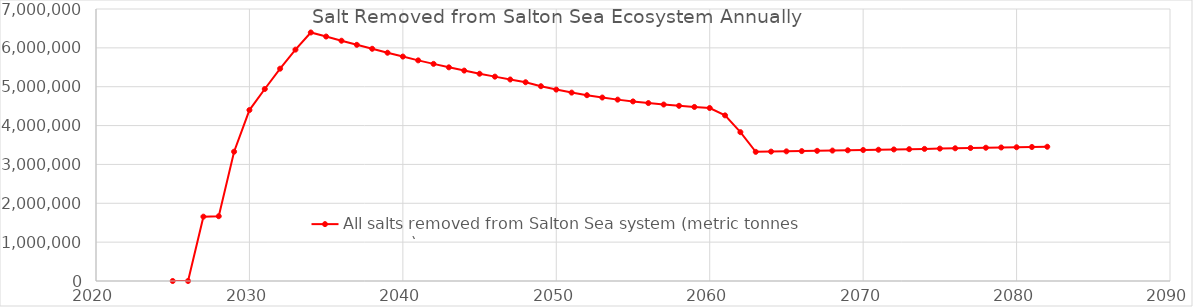
| Category | All salts removed from Salton Sea system (metric tonnes per year) |
|---|---|
| 2025.0 | 0 |
| 2026.0 | 0 |
| 2027.0 | 1655749.961 |
| 2028.0 | 1667511.608 |
| 2029.0 | 3327902.366 |
| 2030.0 | 4399655.873 |
| 2031.0 | 4941128.841 |
| 2032.0 | 5464168.476 |
| 2033.0 | 5954331.5 |
| 2034.0 | 6395647.052 |
| 2035.0 | 6291263.904 |
| 2036.0 | 6183656.916 |
| 2037.0 | 6077883.035 |
| 2038.0 | 5976078.027 |
| 2039.0 | 5874285.273 |
| 2040.0 | 5775570.348 |
| 2041.0 | 5677861.344 |
| 2042.0 | 5587767.18 |
| 2043.0 | 5498803.845 |
| 2044.0 | 5414957.753 |
| 2045.0 | 5333943.542 |
| 2046.0 | 5259218.141 |
| 2047.0 | 5185791.137 |
| 2048.0 | 5115058.603 |
| 2049.0 | 5012958.417 |
| 2050.0 | 4926393.09 |
| 2051.0 | 4848390.866 |
| 2052.0 | 4781469.663 |
| 2053.0 | 4721726.344 |
| 2054.0 | 4667537.967 |
| 2055.0 | 4621267.473 |
| 2056.0 | 4579195.052 |
| 2057.0 | 4541694.574 |
| 2058.0 | 4508854.731 |
| 2059.0 | 4478982.462 |
| 2060.0 | 4451842.252 |
| 2061.0 | 4262600.164 |
| 2062.0 | 3830134.739 |
| 2063.0 | 3323645.579 |
| 2064.0 | 3329880.59 |
| 2065.0 | 3336296.866 |
| 2066.0 | 3342889.025 |
| 2067.0 | 3349652.277 |
| 2068.0 | 3356582.379 |
| 2069.0 | 3363675.607 |
| 2070.0 | 3370928.725 |
| 2071.0 | 3378005.226 |
| 2072.0 | 3385243.907 |
| 2073.0 | 3392641.97 |
| 2074.0 | 3399859.383 |
| 2075.0 | 3407609.718 |
| 2076.0 | 3415508.256 |
| 2077.0 | 3423207.145 |
| 2078.0 | 3429547.945 |
| 2079.0 | 3435888.745 |
| 2080.0 | 3442229.545 |
| 2081.0 | 3448570.345 |
| 2082.0 | 3454911.145 |